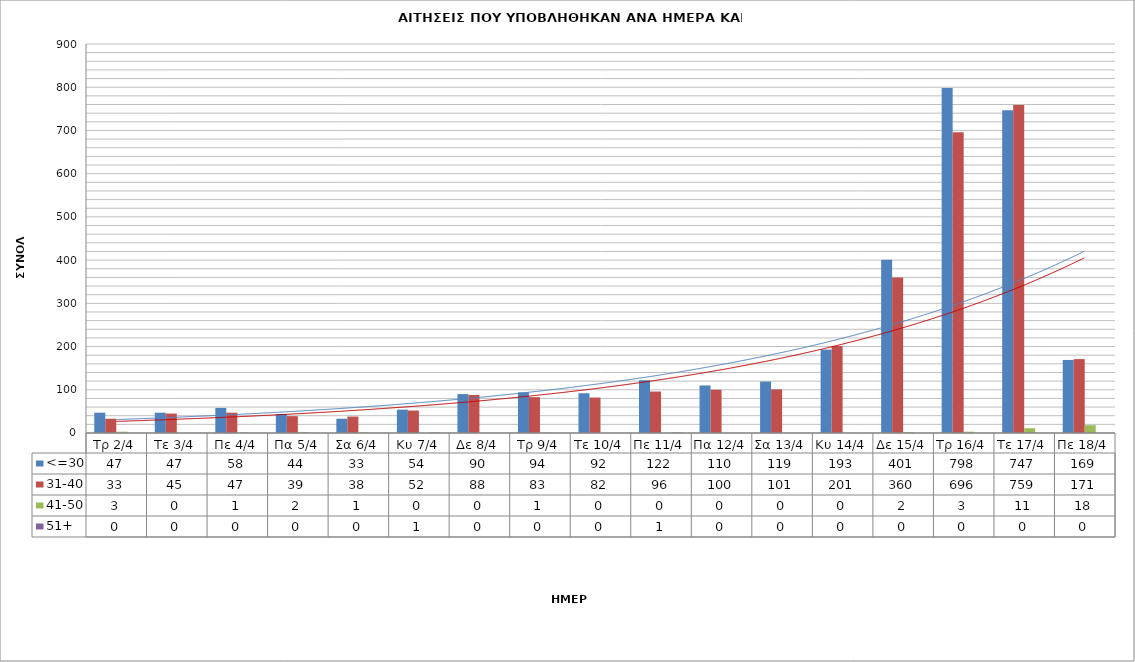
| Category | <=30 | 31-40 | 41-50 | 51+ |
|---|---|---|---|---|
| Τρ 2/4 | 47 | 33 | 3 | 0 |
| Τε 3/4 | 47 | 45 | 0 | 0 |
| Πε 4/4 | 58 | 47 | 1 | 0 |
| Πα 5/4 | 44 | 39 | 2 | 0 |
| Σα 6/4 | 33 | 38 | 1 | 0 |
| Κυ 7/4 | 54 | 52 | 0 | 1 |
| Δε 8/4 | 90 | 88 | 0 | 0 |
| Τρ 9/4 | 94 | 83 | 1 | 0 |
| Τε 10/4 | 92 | 82 | 0 | 0 |
| Πε 11/4 | 122 | 96 | 0 | 1 |
| Πα 12/4 | 110 | 100 | 0 | 0 |
| Σα 13/4 | 119 | 101 | 0 | 0 |
| Κυ 14/4 | 193 | 201 | 0 | 0 |
| Δε 15/4 | 401 | 360 | 2 | 0 |
| Τρ 16/4 | 798 | 696 | 3 | 0 |
| Τε 17/4 | 747 | 759 | 11 | 0 |
| Πε 18/4 | 169 | 171 | 18 | 0 |